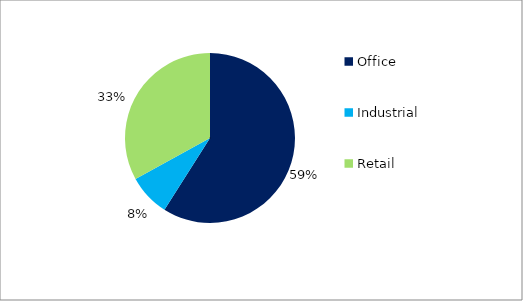
| Category | Series 0 |
|---|---|
| Office | 0.59 |
| Industrial  | 0.08 |
| Retail  | 0.33 |